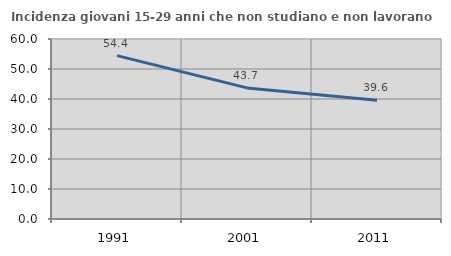
| Category | Incidenza giovani 15-29 anni che non studiano e non lavorano  |
|---|---|
| 1991.0 | 54.448 |
| 2001.0 | 43.697 |
| 2011.0 | 39.607 |